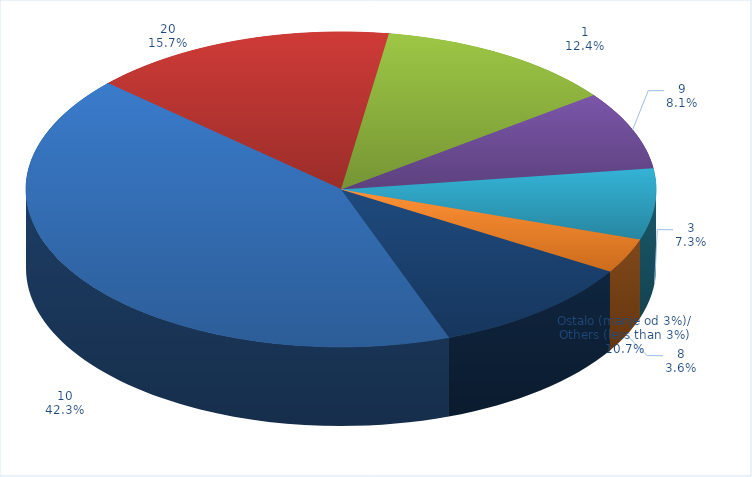
| Category | Series 0 | Series 1 |
|---|---|---|
| 10 | 36728960.566 | 0.423 |
| 20 | 13616919.188 | 0.157 |
| 1 | 10737116.662 | 0.124 |
| 9 | 7003928.172 | 0.081 |
| 3 | 6322805.425 | 0.073 |
| 8 | 3120593.27 | 0.036 |
| Ostalo (manje od 3%)/
Others (less than 3%) | 9299095.229 | 0.107 |